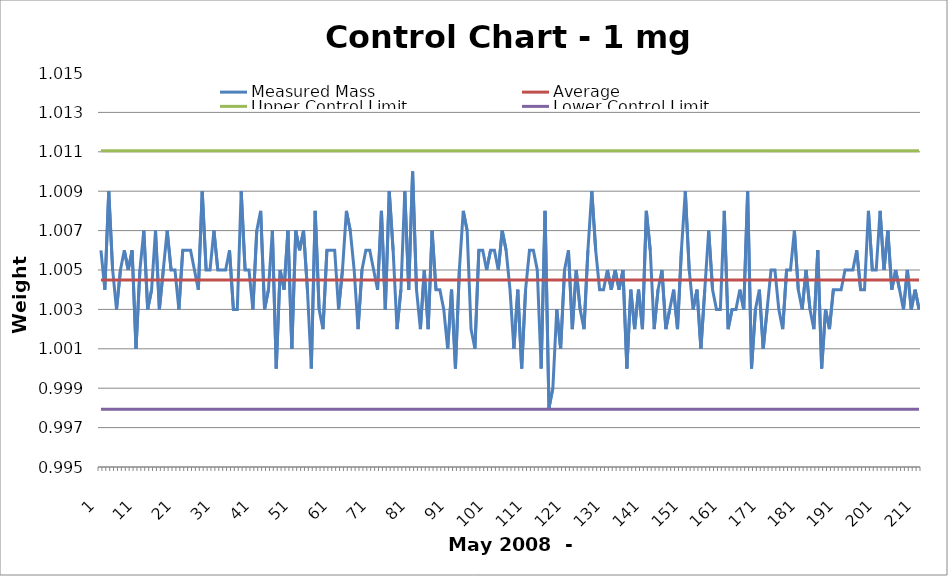
| Category | Measured Mass | Average | Upper Control Limit | Lower Control Limit |
|---|---|---|---|---|
| 1.0 | 1.006 | 1.004 | 1.011 | 0.998 |
| 2.0 | 1.004 | 1.004 | 1.011 | 0.998 |
| 3.0 | 1.009 | 1.004 | 1.011 | 0.998 |
| 4.0 | 1.005 | 1.004 | 1.011 | 0.998 |
| 5.0 | 1.003 | 1.004 | 1.011 | 0.998 |
| 6.0 | 1.005 | 1.004 | 1.011 | 0.998 |
| 7.0 | 1.006 | 1.004 | 1.011 | 0.998 |
| 8.0 | 1.005 | 1.004 | 1.011 | 0.998 |
| 9.0 | 1.006 | 1.004 | 1.011 | 0.998 |
| 10.0 | 1.001 | 1.004 | 1.011 | 0.998 |
| 11.0 | 1.005 | 1.004 | 1.011 | 0.998 |
| 12.0 | 1.007 | 1.004 | 1.011 | 0.998 |
| 13.0 | 1.003 | 1.004 | 1.011 | 0.998 |
| 14.0 | 1.004 | 1.004 | 1.011 | 0.998 |
| 15.0 | 1.007 | 1.004 | 1.011 | 0.998 |
| 16.0 | 1.003 | 1.004 | 1.011 | 0.998 |
| 17.0 | 1.005 | 1.004 | 1.011 | 0.998 |
| 18.0 | 1.007 | 1.004 | 1.011 | 0.998 |
| 19.0 | 1.005 | 1.004 | 1.011 | 0.998 |
| 20.0 | 1.005 | 1.004 | 1.011 | 0.998 |
| 21.0 | 1.003 | 1.004 | 1.011 | 0.998 |
| 22.0 | 1.006 | 1.004 | 1.011 | 0.998 |
| 23.0 | 1.006 | 1.004 | 1.011 | 0.998 |
| 24.0 | 1.006 | 1.004 | 1.011 | 0.998 |
| 25.0 | 1.005 | 1.004 | 1.011 | 0.998 |
| 26.0 | 1.004 | 1.004 | 1.011 | 0.998 |
| 27.0 | 1.009 | 1.004 | 1.011 | 0.998 |
| 28.0 | 1.005 | 1.004 | 1.011 | 0.998 |
| 29.0 | 1.005 | 1.004 | 1.011 | 0.998 |
| 30.0 | 1.007 | 1.004 | 1.011 | 0.998 |
| 31.0 | 1.005 | 1.004 | 1.011 | 0.998 |
| 32.0 | 1.005 | 1.004 | 1.011 | 0.998 |
| 33.0 | 1.005 | 1.004 | 1.011 | 0.998 |
| 34.0 | 1.006 | 1.004 | 1.011 | 0.998 |
| 35.0 | 1.003 | 1.004 | 1.011 | 0.998 |
| 36.0 | 1.003 | 1.004 | 1.011 | 0.998 |
| 37.0 | 1.009 | 1.004 | 1.011 | 0.998 |
| 38.0 | 1.005 | 1.004 | 1.011 | 0.998 |
| 39.0 | 1.005 | 1.004 | 1.011 | 0.998 |
| 40.0 | 1.003 | 1.004 | 1.011 | 0.998 |
| 41.0 | 1.007 | 1.004 | 1.011 | 0.998 |
| 42.0 | 1.008 | 1.004 | 1.011 | 0.998 |
| 43.0 | 1.003 | 1.004 | 1.011 | 0.998 |
| 44.0 | 1.004 | 1.004 | 1.011 | 0.998 |
| 45.0 | 1.007 | 1.004 | 1.011 | 0.998 |
| 46.0 | 1 | 1.004 | 1.011 | 0.998 |
| 47.0 | 1.005 | 1.004 | 1.011 | 0.998 |
| 48.0 | 1.004 | 1.004 | 1.011 | 0.998 |
| 49.0 | 1.007 | 1.004 | 1.011 | 0.998 |
| 50.0 | 1.001 | 1.004 | 1.011 | 0.998 |
| 51.0 | 1.007 | 1.004 | 1.011 | 0.998 |
| 52.0 | 1.006 | 1.004 | 1.011 | 0.998 |
| 53.0 | 1.007 | 1.004 | 1.011 | 0.998 |
| 54.0 | 1.004 | 1.004 | 1.011 | 0.998 |
| 55.0 | 1 | 1.004 | 1.011 | 0.998 |
| 56.0 | 1.008 | 1.004 | 1.011 | 0.998 |
| 57.0 | 1.003 | 1.004 | 1.011 | 0.998 |
| 58.0 | 1.002 | 1.004 | 1.011 | 0.998 |
| 59.0 | 1.006 | 1.004 | 1.011 | 0.998 |
| 60.0 | 1.006 | 1.004 | 1.011 | 0.998 |
| 61.0 | 1.006 | 1.004 | 1.011 | 0.998 |
| 62.0 | 1.003 | 1.004 | 1.011 | 0.998 |
| 63.0 | 1.005 | 1.004 | 1.011 | 0.998 |
| 64.0 | 1.008 | 1.004 | 1.011 | 0.998 |
| 65.0 | 1.007 | 1.004 | 1.011 | 0.998 |
| 66.0 | 1.005 | 1.004 | 1.011 | 0.998 |
| 67.0 | 1.002 | 1.004 | 1.011 | 0.998 |
| 68.0 | 1.005 | 1.004 | 1.011 | 0.998 |
| 69.0 | 1.006 | 1.004 | 1.011 | 0.998 |
| 70.0 | 1.006 | 1.004 | 1.011 | 0.998 |
| 71.0 | 1.005 | 1.004 | 1.011 | 0.998 |
| 72.0 | 1.004 | 1.004 | 1.011 | 0.998 |
| 73.0 | 1.008 | 1.004 | 1.011 | 0.998 |
| 74.0 | 1.003 | 1.004 | 1.011 | 0.998 |
| 75.0 | 1.009 | 1.004 | 1.011 | 0.998 |
| 76.0 | 1.006 | 1.004 | 1.011 | 0.998 |
| 77.0 | 1.002 | 1.004 | 1.011 | 0.998 |
| 78.0 | 1.004 | 1.004 | 1.011 | 0.998 |
| 79.0 | 1.009 | 1.004 | 1.011 | 0.998 |
| 80.0 | 1.004 | 1.004 | 1.011 | 0.998 |
| 81.0 | 1.01 | 1.004 | 1.011 | 0.998 |
| 82.0 | 1.004 | 1.004 | 1.011 | 0.998 |
| 83.0 | 1.002 | 1.004 | 1.011 | 0.998 |
| 84.0 | 1.005 | 1.004 | 1.011 | 0.998 |
| 85.0 | 1.002 | 1.004 | 1.011 | 0.998 |
| 86.0 | 1.007 | 1.004 | 1.011 | 0.998 |
| 87.0 | 1.004 | 1.004 | 1.011 | 0.998 |
| 88.0 | 1.004 | 1.004 | 1.011 | 0.998 |
| 89.0 | 1.003 | 1.004 | 1.011 | 0.998 |
| 90.0 | 1.001 | 1.004 | 1.011 | 0.998 |
| 91.0 | 1.004 | 1.004 | 1.011 | 0.998 |
| 92.0 | 1 | 1.004 | 1.011 | 0.998 |
| 93.0 | 1.005 | 1.004 | 1.011 | 0.998 |
| 94.0 | 1.008 | 1.004 | 1.011 | 0.998 |
| 95.0 | 1.007 | 1.004 | 1.011 | 0.998 |
| 96.0 | 1.002 | 1.004 | 1.011 | 0.998 |
| 97.0 | 1.001 | 1.004 | 1.011 | 0.998 |
| 98.0 | 1.006 | 1.004 | 1.011 | 0.998 |
| 99.0 | 1.006 | 1.004 | 1.011 | 0.998 |
| 100.0 | 1.005 | 1.004 | 1.011 | 0.998 |
| 101.0 | 1.006 | 1.004 | 1.011 | 0.998 |
| 102.0 | 1.006 | 1.004 | 1.011 | 0.998 |
| 103.0 | 1.005 | 1.004 | 1.011 | 0.998 |
| 104.0 | 1.007 | 1.004 | 1.011 | 0.998 |
| 105.0 | 1.006 | 1.004 | 1.011 | 0.998 |
| 106.0 | 1.004 | 1.004 | 1.011 | 0.998 |
| 107.0 | 1.001 | 1.004 | 1.011 | 0.998 |
| 108.0 | 1.004 | 1.004 | 1.011 | 0.998 |
| 109.0 | 1 | 1.004 | 1.011 | 0.998 |
| 110.0 | 1.004 | 1.004 | 1.011 | 0.998 |
| 111.0 | 1.006 | 1.004 | 1.011 | 0.998 |
| 112.0 | 1.006 | 1.004 | 1.011 | 0.998 |
| 113.0 | 1.005 | 1.004 | 1.011 | 0.998 |
| 114.0 | 1 | 1.004 | 1.011 | 0.998 |
| 115.0 | 1.008 | 1.004 | 1.011 | 0.998 |
| 116.0 | 0.998 | 1.004 | 1.011 | 0.998 |
| 117.0 | 0.999 | 1.004 | 1.011 | 0.998 |
| 118.0 | 1.003 | 1.004 | 1.011 | 0.998 |
| 119.0 | 1.001 | 1.004 | 1.011 | 0.998 |
| 120.0 | 1.005 | 1.004 | 1.011 | 0.998 |
| 121.0 | 1.006 | 1.004 | 1.011 | 0.998 |
| 122.0 | 1.002 | 1.004 | 1.011 | 0.998 |
| 123.0 | 1.005 | 1.004 | 1.011 | 0.998 |
| 124.0 | 1.003 | 1.004 | 1.011 | 0.998 |
| 125.0 | 1.002 | 1.004 | 1.011 | 0.998 |
| 126.0 | 1.006 | 1.004 | 1.011 | 0.998 |
| 127.0 | 1.009 | 1.004 | 1.011 | 0.998 |
| 128.0 | 1.006 | 1.004 | 1.011 | 0.998 |
| 129.0 | 1.004 | 1.004 | 1.011 | 0.998 |
| 130.0 | 1.004 | 1.004 | 1.011 | 0.998 |
| 131.0 | 1.005 | 1.004 | 1.011 | 0.998 |
| 132.0 | 1.004 | 1.004 | 1.011 | 0.998 |
| 133.0 | 1.005 | 1.004 | 1.011 | 0.998 |
| 134.0 | 1.004 | 1.004 | 1.011 | 0.998 |
| 135.0 | 1.005 | 1.004 | 1.011 | 0.998 |
| 136.0 | 1 | 1.004 | 1.011 | 0.998 |
| 137.0 | 1.004 | 1.004 | 1.011 | 0.998 |
| 138.0 | 1.002 | 1.004 | 1.011 | 0.998 |
| 139.0 | 1.004 | 1.004 | 1.011 | 0.998 |
| 140.0 | 1.002 | 1.004 | 1.011 | 0.998 |
| 141.0 | 1.008 | 1.004 | 1.011 | 0.998 |
| 142.0 | 1.006 | 1.004 | 1.011 | 0.998 |
| 143.0 | 1.002 | 1.004 | 1.011 | 0.998 |
| 144.0 | 1.004 | 1.004 | 1.011 | 0.998 |
| 145.0 | 1.005 | 1.004 | 1.011 | 0.998 |
| 146.0 | 1.002 | 1.004 | 1.011 | 0.998 |
| 147.0 | 1.003 | 1.004 | 1.011 | 0.998 |
| 148.0 | 1.004 | 1.004 | 1.011 | 0.998 |
| 149.0 | 1.002 | 1.004 | 1.011 | 0.998 |
| 150.0 | 1.006 | 1.004 | 1.011 | 0.998 |
| 151.0 | 1.009 | 1.004 | 1.011 | 0.998 |
| 152.0 | 1.005 | 1.004 | 1.011 | 0.998 |
| 153.0 | 1.003 | 1.004 | 1.011 | 0.998 |
| 154.0 | 1.004 | 1.004 | 1.011 | 0.998 |
| 155.0 | 1.001 | 1.004 | 1.011 | 0.998 |
| 156.0 | 1.004 | 1.004 | 1.011 | 0.998 |
| 157.0 | 1.007 | 1.004 | 1.011 | 0.998 |
| 158.0 | 1.004 | 1.004 | 1.011 | 0.998 |
| 159.0 | 1.003 | 1.004 | 1.011 | 0.998 |
| 160.0 | 1.003 | 1.004 | 1.011 | 0.998 |
| 161.0 | 1.008 | 1.004 | 1.011 | 0.998 |
| 162.0 | 1.002 | 1.004 | 1.011 | 0.998 |
| 163.0 | 1.003 | 1.004 | 1.011 | 0.998 |
| 164.0 | 1.003 | 1.004 | 1.011 | 0.998 |
| 165.0 | 1.004 | 1.004 | 1.011 | 0.998 |
| 166.0 | 1.003 | 1.004 | 1.011 | 0.998 |
| 167.0 | 1.009 | 1.004 | 1.011 | 0.998 |
| 168.0 | 1 | 1.004 | 1.011 | 0.998 |
| 169.0 | 1.003 | 1.004 | 1.011 | 0.998 |
| 170.0 | 1.004 | 1.004 | 1.011 | 0.998 |
| 171.0 | 1.001 | 1.004 | 1.011 | 0.998 |
| 172.0 | 1.003 | 1.004 | 1.011 | 0.998 |
| 173.0 | 1.005 | 1.004 | 1.011 | 0.998 |
| 174.0 | 1.005 | 1.004 | 1.011 | 0.998 |
| 175.0 | 1.003 | 1.004 | 1.011 | 0.998 |
| 176.0 | 1.002 | 1.004 | 1.011 | 0.998 |
| 177.0 | 1.005 | 1.004 | 1.011 | 0.998 |
| 178.0 | 1.005 | 1.004 | 1.011 | 0.998 |
| 179.0 | 1.007 | 1.004 | 1.011 | 0.998 |
| 180.0 | 1.004 | 1.004 | 1.011 | 0.998 |
| 181.0 | 1.003 | 1.004 | 1.011 | 0.998 |
| 182.0 | 1.005 | 1.004 | 1.011 | 0.998 |
| 183.0 | 1.003 | 1.004 | 1.011 | 0.998 |
| 184.0 | 1.002 | 1.004 | 1.011 | 0.998 |
| 185.0 | 1.006 | 1.004 | 1.011 | 0.998 |
| 186.0 | 1 | 1.004 | 1.011 | 0.998 |
| 187.0 | 1.003 | 1.004 | 1.011 | 0.998 |
| 188.0 | 1.002 | 1.004 | 1.011 | 0.998 |
| 189.0 | 1.004 | 1.004 | 1.011 | 0.998 |
| 190.0 | 1.004 | 1.004 | 1.011 | 0.998 |
| 191.0 | 1.004 | 1.004 | 1.011 | 0.998 |
| 192.0 | 1.005 | 1.004 | 1.011 | 0.998 |
| 193.0 | 1.005 | 1.004 | 1.011 | 0.998 |
| 194.0 | 1.005 | 1.004 | 1.011 | 0.998 |
| 195.0 | 1.006 | 1.004 | 1.011 | 0.998 |
| 196.0 | 1.004 | 1.004 | 1.011 | 0.998 |
| 197.0 | 1.004 | 1.004 | 1.011 | 0.998 |
| 198.0 | 1.008 | 1.004 | 1.011 | 0.998 |
| 199.0 | 1.005 | 1.004 | 1.011 | 0.998 |
| 200.0 | 1.005 | 1.004 | 1.011 | 0.998 |
| 201.0 | 1.008 | 1.004 | 1.011 | 0.998 |
| 202.0 | 1.005 | 1.004 | 1.011 | 0.998 |
| 203.0 | 1.007 | 1.004 | 1.011 | 0.998 |
| 204.0 | 1.004 | 1.004 | 1.011 | 0.998 |
| 205.0 | 1.005 | 1.004 | 1.011 | 0.998 |
| 206.0 | 1.004 | 1.004 | 1.011 | 0.998 |
| 207.0 | 1.003 | 1.004 | 1.011 | 0.998 |
| 208.0 | 1.005 | 1.004 | 1.011 | 0.998 |
| 209.0 | 1.003 | 1.004 | 1.011 | 0.998 |
| 210.0 | 1.004 | 1.004 | 1.011 | 0.998 |
| 211.0 | 1.003 | 1.004 | 1.011 | 0.998 |